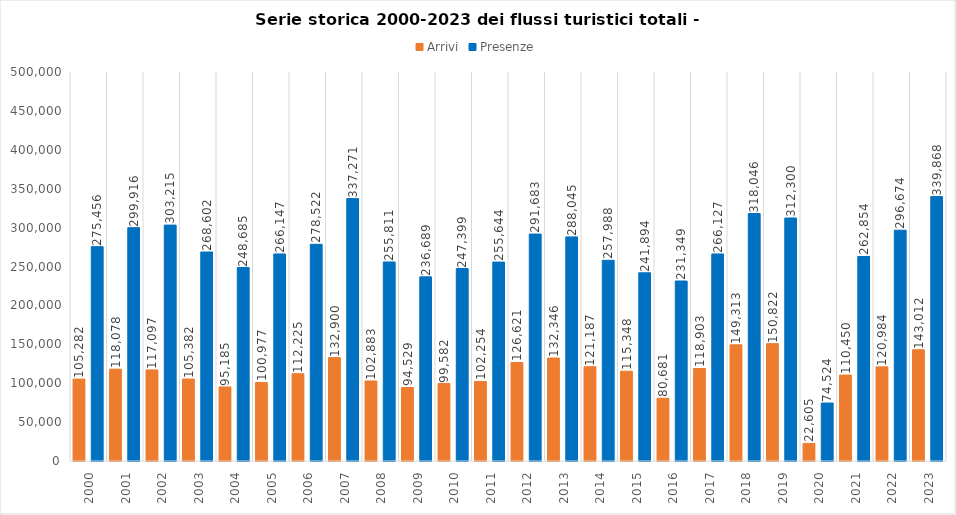
| Category | Arrivi | Presenze |
|---|---|---|
| 2000.0 | 105282 | 275456 |
| 2001.0 | 118078 | 299916 |
| 2002.0 | 117097 | 303215 |
| 2003.0 | 105382 | 268602 |
| 2004.0 | 95185 | 248685 |
| 2005.0 | 100977 | 266147 |
| 2006.0 | 112225 | 278522 |
| 2007.0 | 132900 | 337271 |
| 2008.0 | 102883 | 255811 |
| 2009.0 | 94529 | 236689 |
| 2010.0 | 99582 | 247399 |
| 2011.0 | 102254 | 255644 |
| 2012.0 | 126621 | 291683 |
| 2013.0 | 132346 | 288045 |
| 2014.0 | 121187 | 257988 |
| 2015.0 | 115348 | 241894 |
| 2016.0 | 80681 | 231349 |
| 2017.0 | 118903 | 266127 |
| 2018.0 | 149313 | 318046 |
| 2019.0 | 150822 | 312300 |
| 2020.0 | 22605 | 74524 |
| 2021.0 | 110450 | 262854 |
| 2022.0 | 120984 | 296674 |
| 2023.0 | 143012 | 339868 |